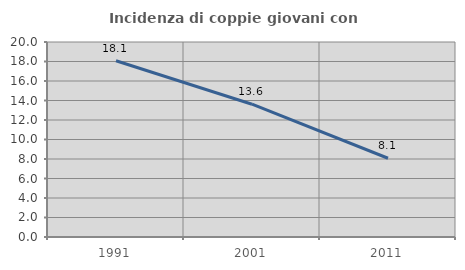
| Category | Incidenza di coppie giovani con figli |
|---|---|
| 1991.0 | 18.075 |
| 2001.0 | 13.62 |
| 2011.0 | 8.078 |